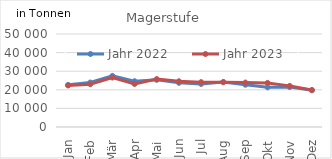
| Category | Jahr 2022 | Jahr 2023 |
|---|---|---|
| 0 | 22653.165 | 22335.356 |
| 1 | 23906.903 | 22988.848 |
| 2 | 27502.356 | 26602.411 |
| 3 | 24622.717 | 23142.572 |
| 4 | 25370.268 | 25760.065 |
| 5 | 23752.398 | 24581.931 |
| 6 | 23143.876 | 24117.138 |
| 7 | 24162.921 | 24096.927 |
| 8 | 22732.007 | 23895.307 |
| 9 | 21313.569 | 23706.945 |
| 10 | 21460.856 | 22109.424 |
| 11 | 19720.998 | 19904.784 |